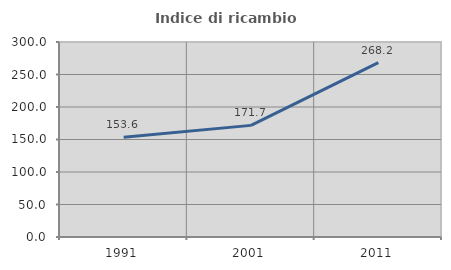
| Category | Indice di ricambio occupazionale  |
|---|---|
| 1991.0 | 153.584 |
| 2001.0 | 171.737 |
| 2011.0 | 268.209 |